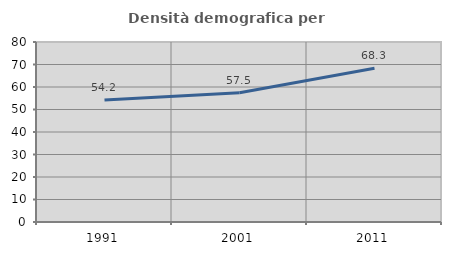
| Category | Densità demografica |
|---|---|
| 1991.0 | 54.178 |
| 2001.0 | 57.47 |
| 2011.0 | 68.311 |